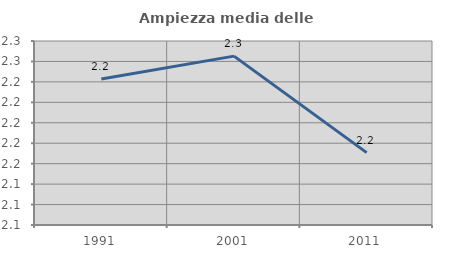
| Category | Ampiezza media delle famiglie |
|---|---|
| 1991.0 | 2.243 |
| 2001.0 | 2.265 |
| 2011.0 | 2.171 |